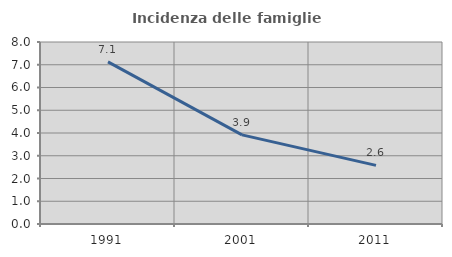
| Category | Incidenza delle famiglie numerose |
|---|---|
| 1991.0 | 7.129 |
| 2001.0 | 3.917 |
| 2011.0 | 2.578 |